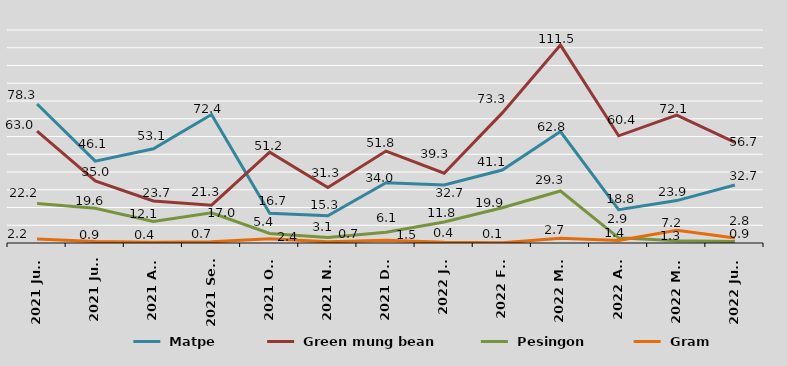
| Category |  Matpe |  Green mung bean |  Pesingon |  Gram  |
|---|---|---|---|---|
| 2021 June | 78.3 | 63 | 22.2 | 2.2 |
| 2021 July | 46.1 | 35 | 19.6 | 0.9 |
| 2021 Aug | 53.1 | 23.7 | 12.1 | 0.4 |
| 2021 Sept | 72.4 | 21.3 | 17 | 0.7 |
| 2021 Oct | 16.7 | 51.2 | 5.4 | 2.4 |
| 2021 Nov | 15.3 | 31.3 | 3.1 | 0.7 |
| 2021 Dec | 34 | 51.8 | 6.1 | 1.5 |
| 2022 Jan | 32.7 | 39.3 | 11.8 | 0.4 |
| 2022 Feb | 41.1 | 73.3 | 19.9 | 0.1 |
| 2022 Mar | 62.8 | 111.5 | 29.3 | 2.7 |
| 2022 Apr | 18.8 | 60.4 | 2.9 | 1.4 |
| 2022 May | 23.9 | 72.1 | 1.3 | 7.2 |
| 2022 June | 32.7 | 56.7 | 0.9 | 2.8 |